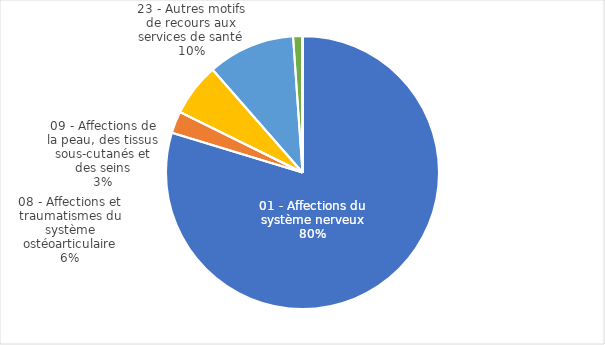
| Category | Series 0 |
|---|---|
| 01 - Affections du système nerveux | 2160 |
| 09 - Affections de la peau, des tissus sous-cutanés et des seins | 70 |
| 11 - Affections de l’appareil génito-urinaire | 0 |
| 08 - Affections et traumatismes du système ostéoarticulaire | 170 |
| 23 - Autres motifs de recours aux services de santé | 280 |
| 06 - Affections des organes digestifs | 30 |
| 04 - Affections de l'appareil respiratoire | 0 |
| 19 - Troubles mentaux et du comportement | 0 |
| 05 - Affections de l'appareil circulatoire | 0 |
| 10 - Affections endocriniennes, métaboliques et nutritionnelles | 0 |